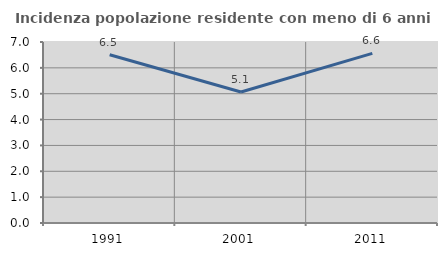
| Category | Incidenza popolazione residente con meno di 6 anni |
|---|---|
| 1991.0 | 6.506 |
| 2001.0 | 5.065 |
| 2011.0 | 6.561 |